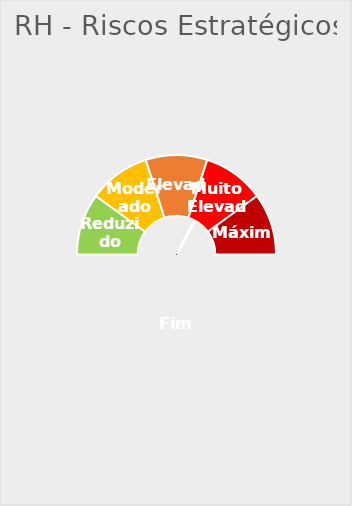
| Category | 65 1,5 133,5 |
|---|---|
| 0 | 65 |
| 1 | 1.5 |
| 2 | 133.5 |